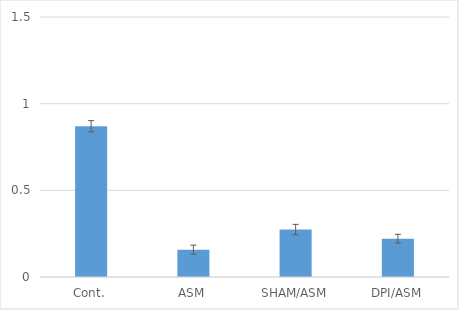
| Category | Series 0 |
|---|---|
| Cont. | 0.87 |
| ASM | 0.158 |
| SHAM/ASM | 0.274 |
| DPI/ASM | 0.221 |